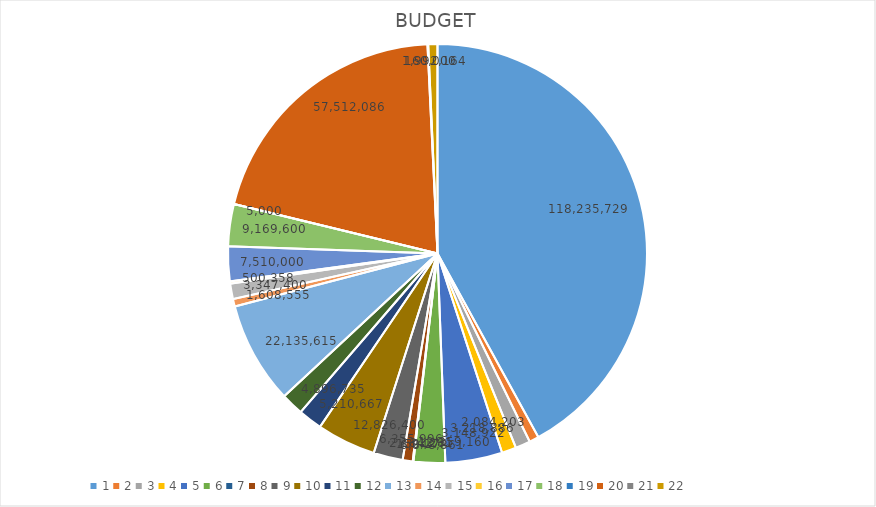
| Category | BUDGET |
|---|---|
| 0 | 118235729 |
| 1 | 2084203 |
| 2 | 3218886 |
| 3 | 3148922 |
| 4 | 12359160 |
| 5 | 6848861 |
| 6 | 150174 |
| 7 | 2184281 |
| 8 | 6355996 |
| 9 | 12826400 |
| 10 | 5210667 |
| 11 | 4896735 |
| 12 | 22135615 |
| 13 | 1608555 |
| 14 | 3347400 |
| 15 | 500358 |
| 16 | 7510000 |
| 17 | 9169600 |
| 18 | 5000 |
| 19 | 57512086 |
| 20 | 160000 |
| 21 | 1992164 |